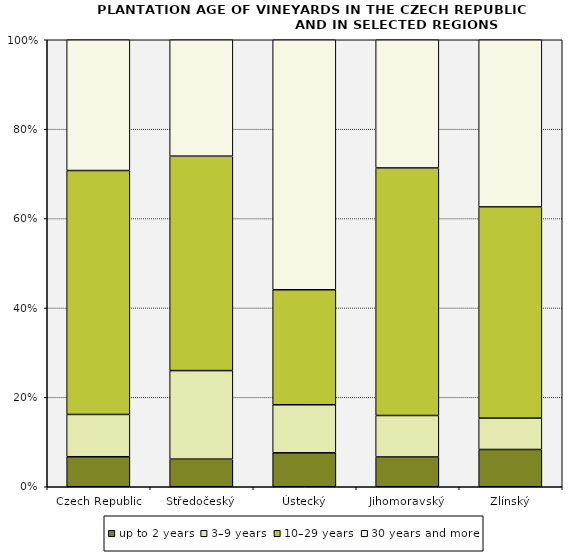
| Category | up to 2 years | 3–9 years | 10–29 years | 30 years and more |
|---|---|---|---|---|
| Czech Republic | 1187.496 | 1673.786 | 9652.373 | 5174.935 |
| Středočeský | 20.093 | 64.434 | 156.036 | 84.717 |
| Ústecký | 23.594 | 33.363 | 79.88 | 173.659 |
| Jihomoravský | 1111.724 | 1548.483 | 9242.206 | 4786.449 |
| Zlínský | 28.554 | 24.035 | 161.797 | 128.045 |